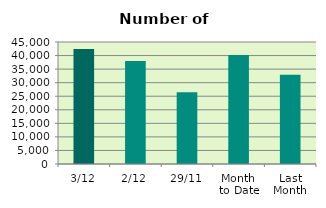
| Category | Series 0 |
|---|---|
| 3/12 | 42374 |
| 2/12 | 38010 |
| 29/11 | 26508 |
| Month 
to Date | 40192 |
| Last
Month | 32932.667 |